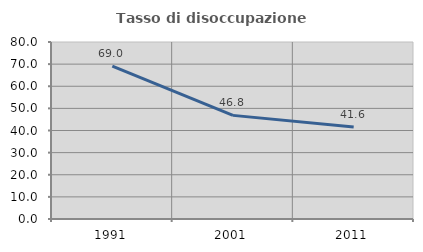
| Category | Tasso di disoccupazione giovanile  |
|---|---|
| 1991.0 | 69.048 |
| 2001.0 | 46.835 |
| 2011.0 | 41.558 |